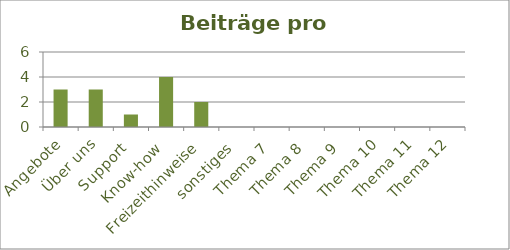
| Category | Beiträge |
|---|---|
| Angebote | 3 |
| Über uns | 3 |
| Support | 1 |
| Know-how | 4 |
| Freizeithinweise | 2 |
| sonstiges | 0 |
| Thema 7 | 0 |
| Thema 8 | 0 |
| Thema 9 | 0 |
| Thema 10 | 0 |
| Thema 11 | 0 |
| Thema 12 | 0 |